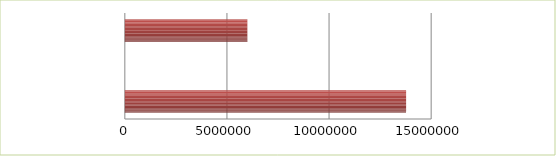
| Category | Series 0 | Series 1 |
|---|---|---|
| 0 | 2.5 | 13773125 |
| 1 | 2.6 | 0 |
| 2 | 2.7 | 6000000 |